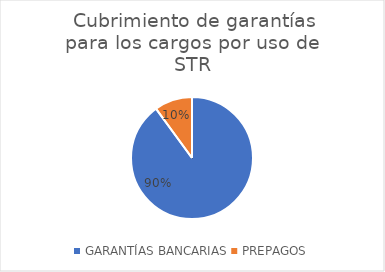
| Category | Garantias Bancarías |
|---|---|
| GARANTÍAS BANCARIAS | 363034711137.667 |
| PREPAGOS | 40580427285 |